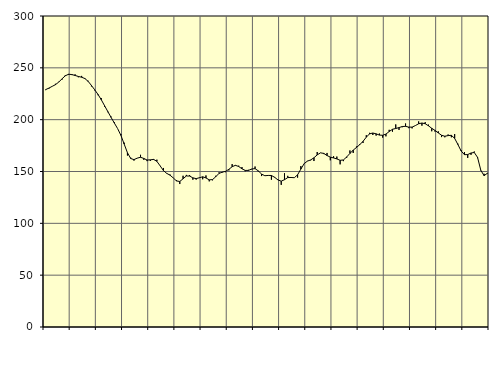
| Category | Piggar | Series 1 |
|---|---|---|
| nan | 228.5 | 228.99 |
| 87.0 | 229.9 | 230.46 |
| 87.0 | 232.1 | 232.12 |
| 87.0 | 234.6 | 233.77 |
| nan | 236.5 | 236.21 |
| 88.0 | 238.6 | 239.39 |
| 88.0 | 243 | 242.3 |
| 88.0 | 243.2 | 243.8 |
| nan | 243 | 243.53 |
| 89.0 | 243.7 | 242.62 |
| 89.0 | 240.9 | 241.7 |
| 89.0 | 242.2 | 240.94 |
| nan | 240.1 | 239.66 |
| 90.0 | 237.5 | 236.91 |
| 90.0 | 232.1 | 232.99 |
| 90.0 | 228.3 | 228.8 |
| nan | 223.6 | 224.38 |
| 91.0 | 220.8 | 219.25 |
| 91.0 | 212.5 | 213.54 |
| 91.0 | 207.2 | 207.82 |
| nan | 203 | 202.2 |
| 92.0 | 197.5 | 196.71 |
| 92.0 | 191.4 | 191.39 |
| 92.0 | 186.1 | 184.88 |
| nan | 177.8 | 176.49 |
| 93.0 | 165.4 | 168.1 |
| 93.0 | 163.3 | 162.52 |
| 93.0 | 160.5 | 161.46 |
| nan | 163 | 162.91 |
| 94.0 | 166.1 | 163.72 |
| 94.0 | 161.3 | 162.6 |
| 94.0 | 160 | 161.07 |
| nan | 160.2 | 161.27 |
| 95.0 | 161.1 | 161.66 |
| 95.0 | 161.4 | 159.78 |
| 95.0 | 155.3 | 155.4 |
| nan | 153.4 | 150.91 |
| 96.0 | 148 | 148.22 |
| 96.0 | 147.1 | 146.48 |
| 96.0 | 143.9 | 143.83 |
| nan | 141.6 | 140.88 |
| 97.0 | 137.9 | 140.37 |
| 97.0 | 145.9 | 142.99 |
| 97.0 | 146.7 | 145.66 |
| nan | 146.6 | 145.6 |
| 98.0 | 142.1 | 143.88 |
| 98.0 | 142.2 | 143.14 |
| 98.0 | 144.3 | 143.97 |
| nan | 142.5 | 144.91 |
| 99.0 | 146.2 | 143.79 |
| 99.0 | 140.5 | 141.96 |
| 99.0 | 141.5 | 142.19 |
| nan | 145.9 | 144.98 |
| 0.0 | 149.2 | 148.2 |
| 0.0 | 149 | 149.38 |
| 0.0 | 149.3 | 150.17 |
| nan | 151 | 152.11 |
| 1.0 | 157.1 | 154.62 |
| 1.0 | 155.6 | 155.96 |
| 1.0 | 155.6 | 154.81 |
| nan | 154.3 | 152.6 |
| 2.0 | 150.2 | 151.04 |
| 2.0 | 151.6 | 151.04 |
| 2.0 | 152 | 152.45 |
| nan | 154.8 | 152.76 |
| 3.0 | 150 | 150.59 |
| 3.0 | 145.6 | 147.49 |
| 3.0 | 145.8 | 145.92 |
| nan | 146.2 | 146.2 |
| 4.0 | 142.1 | 146.15 |
| 4.0 | 144.7 | 144.38 |
| 4.0 | 142.2 | 141.85 |
| nan | 137.1 | 140.7 |
| 5.0 | 148.3 | 142.08 |
| 5.0 | 145.8 | 144.14 |
| 5.0 | 144.3 | 144.23 |
| nan | 144 | 144.01 |
| 6.0 | 144.1 | 146.81 |
| 6.0 | 155.2 | 152.31 |
| 6.0 | 157.4 | 157.58 |
| nan | 160.2 | 160.02 |
| 7.0 | 160.8 | 161.16 |
| 7.0 | 160.1 | 163.24 |
| 7.0 | 168.8 | 166.01 |
| nan | 167.9 | 168 |
| 8.0 | 166.8 | 167.46 |
| 8.0 | 167.9 | 165.4 |
| 8.0 | 160.8 | 163.87 |
| nan | 164.7 | 163.08 |
| 9.0 | 164.4 | 162.14 |
| 9.0 | 156.9 | 160.8 |
| 9.0 | 160 | 161.14 |
| nan | 163.2 | 163.99 |
| 10.0 | 170.3 | 167.44 |
| 10.0 | 167.9 | 170.6 |
| 10.0 | 174.1 | 173.19 |
| nan | 176.5 | 175.88 |
| 11.0 | 177.5 | 179.09 |
| 11.0 | 185 | 183.1 |
| 11.0 | 187.3 | 186.33 |
| nan | 185.2 | 187.13 |
| 12.0 | 184.6 | 186.35 |
| 12.0 | 186.6 | 185.13 |
| 12.0 | 182.7 | 184.95 |
| nan | 183.9 | 186.07 |
| 13.0 | 190.2 | 188.54 |
| 13.0 | 188.4 | 190.72 |
| 13.0 | 195.4 | 191.48 |
| nan | 190.1 | 192.34 |
| 14.0 | 192.7 | 193.4 |
| 14.0 | 196.3 | 193.57 |
| 14.0 | 191.8 | 192.81 |
| nan | 191.6 | 192.81 |
| 15.0 | 194.4 | 194.31 |
| 15.0 | 198.3 | 196.04 |
| 15.0 | 194.2 | 196.78 |
| nan | 197.6 | 196.09 |
| 16.0 | 195.2 | 194.07 |
| 16.0 | 188.8 | 191.69 |
| 16.0 | 188.5 | 189.63 |
| nan | 188.7 | 187.22 |
| 17.0 | 183.2 | 184.96 |
| 17.0 | 183 | 184.03 |
| 17.0 | 185.7 | 184.63 |
| nan | 183 | 184.9 |
| 18.0 | 186.1 | 181.98 |
| 18.0 | 176.8 | 176.01 |
| 18.0 | 170.5 | 169.7 |
| nan | 168.8 | 166.23 |
| 19.0 | 163.1 | 166.35 |
| 19.0 | 166.1 | 167.85 |
| 19.0 | 169.3 | 168.32 |
| nan | 162.9 | 163.64 |
| 20.0 | 150.8 | 151.17 |
| 20.0 | 147.8 | 145.99 |
| 20.0 | 147.8 | 148.27 |